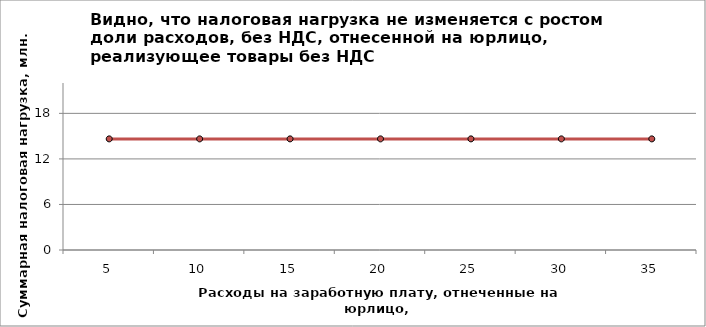
| Category | Налоговая нагрузка |
|---|---|
| 5.0 | 14.638 |
| 10.0 | 14.638 |
| 15.0 | 14.638 |
| 20.0 | 14.638 |
| 25.0 | 14.638 |
| 30.0 | 14.638 |
| 35.0 | 14.638 |